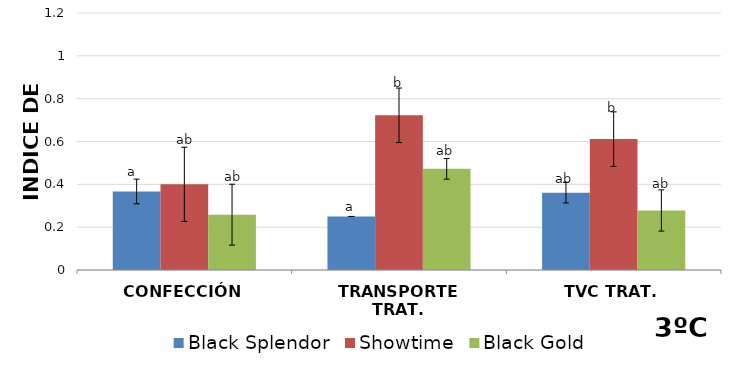
| Category | Black Splendor | Showtime | Black Gold |
|---|---|---|---|
| CONFECCIÓN | 0.367 | 0.4 | 0.258 |
| TRANSPORTE TRAT. | 0.25 | 0.722 | 0.472 |
| TVC TRAT. | 0.361 | 0.611 | 0.278 |